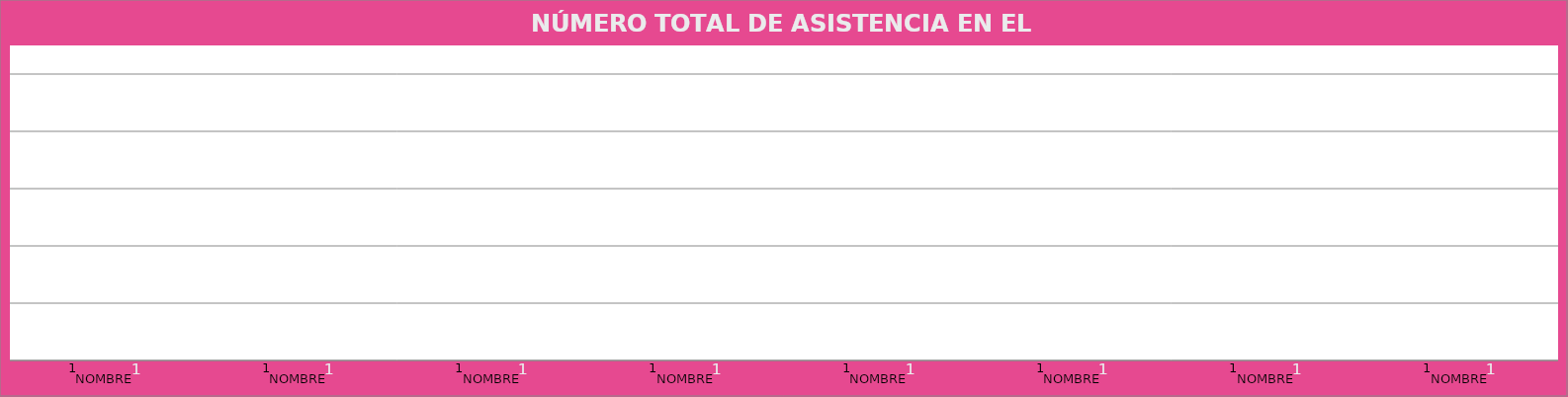
| Category | NOMBRE | Jael Chamú Ponce José Luis Salazar Martínez  Alma Dolores Hurtado Castillo Juan Martín Núñez Morán Roberto Gerardo Albarrán Magaña   María del Rosario Velázquez Hernández Luis Arturo Morones Vargas  Ana Rosa Loza Agraz    |
|---|---|---|
| NOMBRE | 1 | 1 |
| NOMBRE | 1 | 1 |
| NOMBRE | 1 | 1 |
| NOMBRE | 1 | 1 |
| NOMBRE | 1 | 1 |
| NOMBRE | 1 | 1 |
| NOMBRE | 1 | 1 |
| NOMBRE | 1 | 1 |